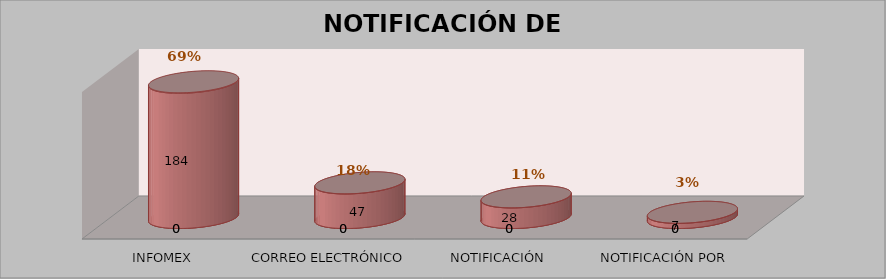
| Category | Series 0 | Series 1 | Series 2 | Series 3 |
|---|---|---|---|---|
| INFOMEX |  |  | 184 | 0.692 |
| CORREO ELECTRÓNICO |  |  | 47 | 0.177 |
| NOTIFICACIÓN PERSONAL |  |  | 28 | 0.105 |
| NOTIFICACIÓN POR LISTAS |  |  | 7 | 0.026 |